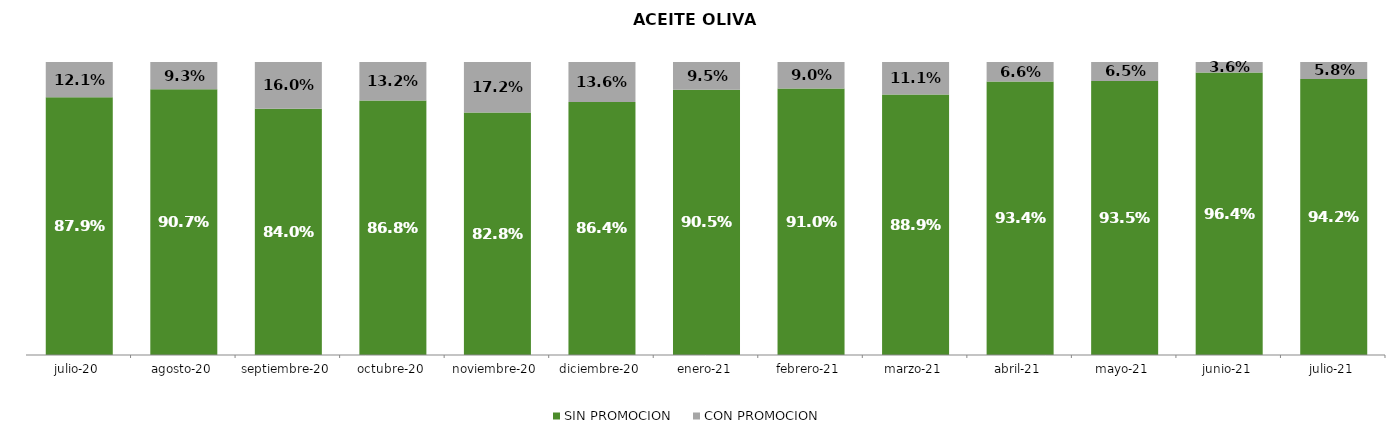
| Category | SIN PROMOCION   | CON PROMOCION   |
|---|---|---|
| 2020-07-01 | 0.879 | 0.121 |
| 2020-08-01 | 0.907 | 0.093 |
| 2020-09-01 | 0.84 | 0.16 |
| 2020-10-01 | 0.868 | 0.132 |
| 2020-11-01 | 0.828 | 0.172 |
| 2020-12-01 | 0.864 | 0.136 |
| 2021-01-01 | 0.905 | 0.095 |
| 2021-02-01 | 0.91 | 0.09 |
| 2021-03-01 | 0.889 | 0.111 |
| 2021-04-01 | 0.934 | 0.066 |
| 2021-05-01 | 0.935 | 0.065 |
| 2021-06-01 | 0.964 | 0.036 |
| 2021-07-01 | 0.942 | 0.058 |